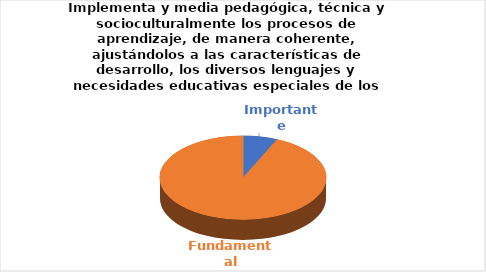
| Category | Series 0 |
|---|---|
| Importante | 1 |
| Fundamental | 14 |